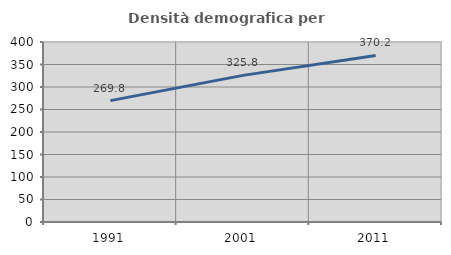
| Category | Densità demografica |
|---|---|
| 1991.0 | 269.753 |
| 2001.0 | 325.847 |
| 2011.0 | 370.172 |